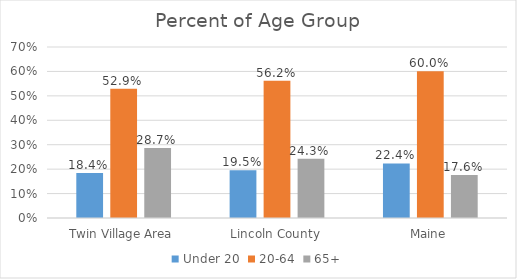
| Category | Under 20 | 20-64 | 65+ |
|---|---|---|---|
| Twin Village Area | 0.184 | 0.529 | 0.287 |
| Lincoln County | 0.195 | 0.562 | 0.243 |
| Maine | 0.224 | 0.6 | 0.176 |